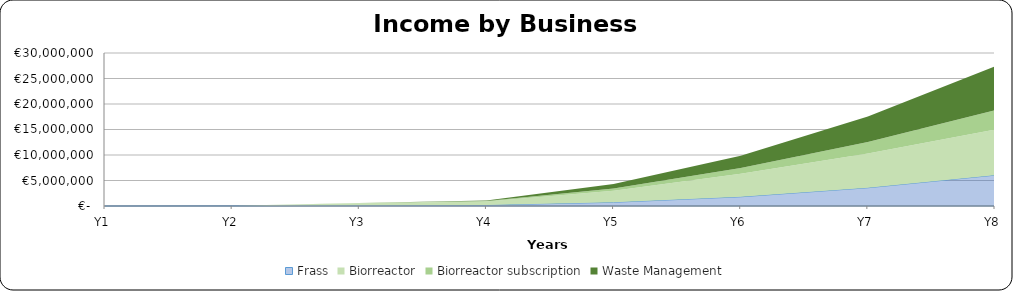
| Category |  Frass  |  Biorreactor   |  Biorreactor subscription  | Waste Management |
|---|---|---|---|---|
| 0 | 0 | 0 | 0 | 0 |
| 1 | 43596 | 0 | 0 | 0 |
| 2 | 150164 | 390000 | 50000 | 0 |
| 3 | 191822.4 | 680000 | 132860 | 81000 |
| 4 | 726600 | 2250000 | 472760 | 855000 |
| 5 | 1801968 | 4500000 | 1147600 | 2412000 |
| 6 | 3574872 | 6720000 | 2248680 | 4995000 |
| 7 | 6045312 | 8960000 | 3776000 | 8604000 |